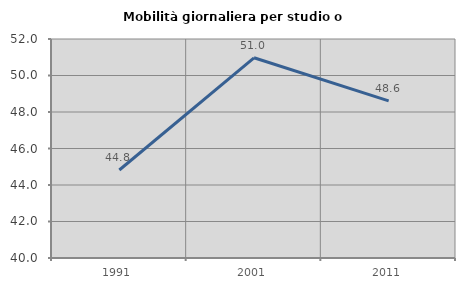
| Category | Mobilità giornaliera per studio o lavoro |
|---|---|
| 1991.0 | 44.822 |
| 2001.0 | 50.97 |
| 2011.0 | 48.608 |